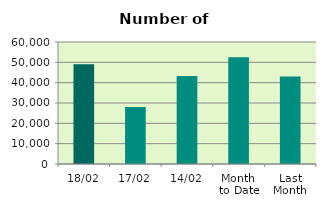
| Category | Series 0 |
|---|---|
| 18/02 | 49020 |
| 17/02 | 28080 |
| 14/02 | 43290 |
| Month 
to Date | 52443.5 |
| Last
Month | 43047.455 |